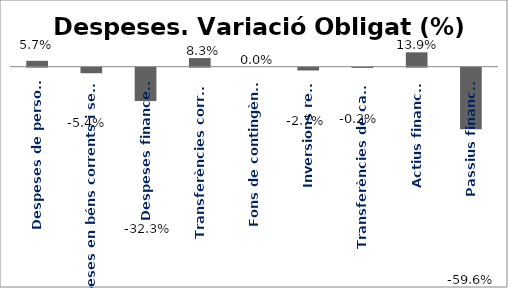
| Category | Series 0 |
|---|---|
| Despeses de personal | 0.057 |
| Despeses en béns corrents i serveis | -0.054 |
| Despeses financeres | -0.323 |
| Transferències corrents | 0.083 |
| Fons de contingència | 0 |
| Inversions reals | -0.027 |
| Transferències de capital | -0.002 |
| Actius financers | 0.139 |
| Passius financers | -0.596 |